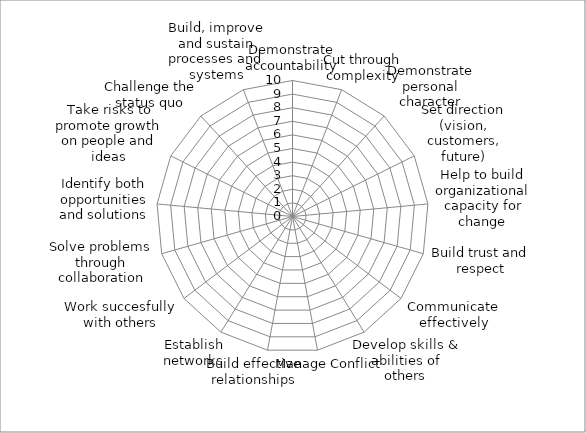
| Category | Series 0 | Series 1 | Series 2 | Series 3 | Series 4 | Series 5 | Series 6 | Series 7 |
|---|---|---|---|---|---|---|---|---|
| Demonstrate accountability |  |  |  |  |  |  |  | 0 |
| Cut through complexity |  |  |  |  |  |  |  | 0 |
| Demonstrate personal character |  |  |  |  |  |  |  | 0 |
| Set direction (vision, customers, future) |  |  |  |  |  |  |  | 0 |
| Help to build organizational capacity for change |  |  |  |  |  |  |  | 0 |
| Build trust and respect |  |  |  |  |  |  |  | 0 |
| Communicate effectively |  |  |  |  |  |  |  | 0 |
| Develop skills & abilities of others |  |  |  |  |  |  |  | 0 |
| Manage Conflict |  |  |  |  |  |  |  | 0 |
| Build effective relationships |  |  |  |  |  |  |  | 0 |
| Establish networks |  |  |  |  |  |  |  | 0 |
| Work succesfully with others |  |  |  |  |  |  |  | 0 |
| Solve problems through collaboration |  |  |  |  |  |  |  | 0 |
| Identify both opportunities and solutions |  |  |  |  |  |  |  | 0 |
| Take risks to promote growth on people and ideas |  |  |  |  |  |  |  | 0 |
| Challenge the status quo |  |  |  |  |  |  |  | 0 |
| Build, improve and sustain processes and systems |  |  |  |  |  |  |  | 0 |